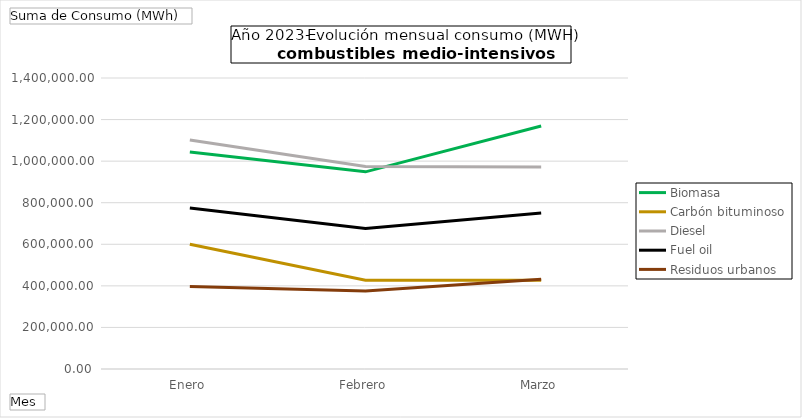
| Category | Biomasa | Carbón bituminoso | Diesel | Fuel oil | Residuos urbanos |
|---|---|---|---|---|---|
| Enero | 1043680.933 | 600491 | 1101367.27 | 774332.65 | 397158.1 |
| Febrero | 948521.23 | 427175 | 974467.583 | 676573.46 | 375471.827 |
| Marzo | 1169310.18 | 427060 | 971322.553 | 750926.58 | 432309.117 |